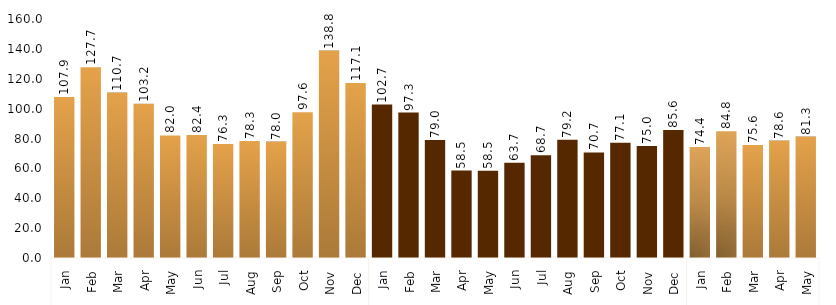
| Category | Series 0 |
|---|---|
| 0 | 107.861 |
| 1 | 127.674 |
| 2 | 110.742 |
| 3 | 103.239 |
| 4 | 82.016 |
| 5 | 82.421 |
| 6 | 76.314 |
| 7 | 78.265 |
| 8 | 77.961 |
| 9 | 97.566 |
| 10 | 138.85 |
| 11 | 117.091 |
| 12 | 102.678 |
| 13 | 97.332 |
| 14 | 78.955 |
| 15 | 58.549 |
| 16 | 58.455 |
| 17 | 63.691 |
| 18 | 68.721 |
| 19 | 79.161 |
| 20 | 70.692 |
| 21 | 77.111 |
| 22 | 74.955 |
| 23 | 85.627 |
| 24 | 74.378 |
| 25 | 84.831 |
| 26 | 75.573 |
| 27 | 78.621 |
| 28 | 81.312 |